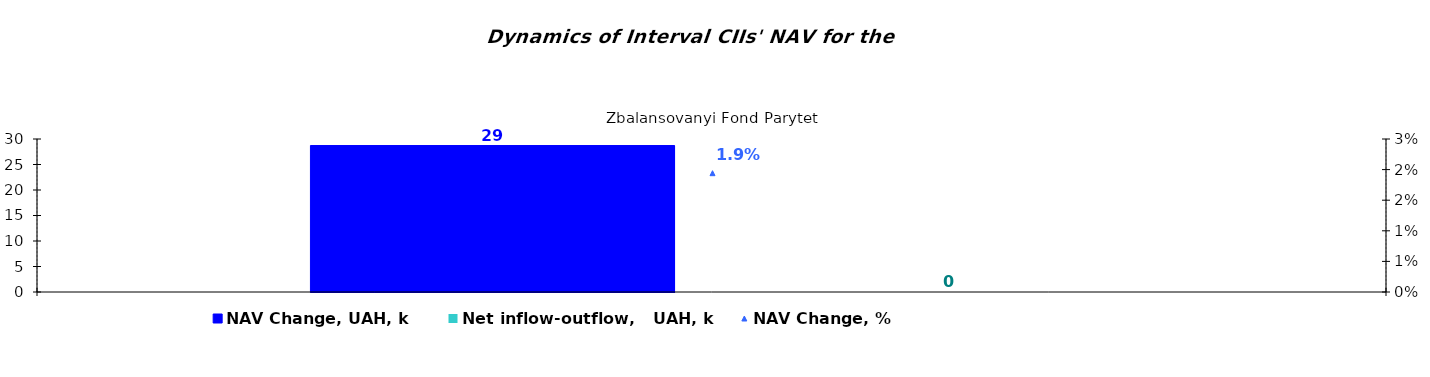
| Category | NAV Change, UAH, k | Net inflow-outflow,   UAH, k |
|---|---|---|
| Zbalansovanyi Fond Parytet | 28.72 | 0 |